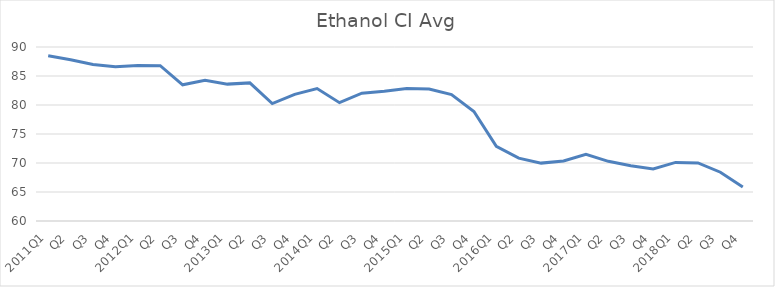
| Category | Series 0 |
|---|---|
| 2011Q1 | 88.48 |
| Q2 | 87.8 |
| Q3 | 87 |
| Q4 | 86.6 |
| 2012Q1 | 86.8 |
| Q2 | 86.78 |
| Q3 | 83.48 |
| Q4 | 84.27 |
| 2013Q1 | 83.6 |
| Q2 | 83.81 |
| Q3 | 80.24 |
| Q4 | 81.84 |
| 2014Q1 | 82.83 |
| Q2 | 80.4 |
| Q3 | 82.03 |
| Q4 | 82.38 |
| 2015Q1 | 82.86 |
| Q2 | 82.75 |
| Q3 | 81.8 |
| Q4 | 78.87 |
| 2016Q1 | 72.87 |
| Q2 | 70.83 |
| Q3 | 69.98 |
| Q4 | 70.34 |
| 2017Q1 | 71.49 |
| Q2 | 70.29 |
| Q3 | 69.51 |
| Q4 | 68.98 |
| 2018Q1 | 70.1 |
| Q2 | 70.02 |
| Q3 | 68.41 |
| Q4 | 65.88 |